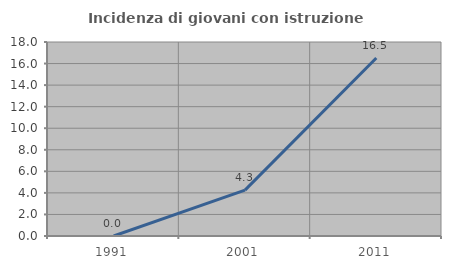
| Category | Incidenza di giovani con istruzione universitaria |
|---|---|
| 1991.0 | 0 |
| 2001.0 | 4.255 |
| 2011.0 | 16.514 |